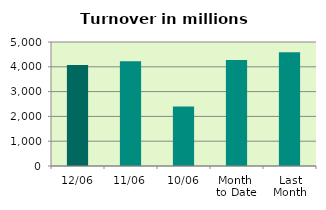
| Category | Series 0 |
|---|---|
| 12/06 | 4069.006 |
| 11/06 | 4221.112 |
| 10/06 | 2401.431 |
| Month 
to Date | 4276.174 |
| Last
Month | 4586.899 |